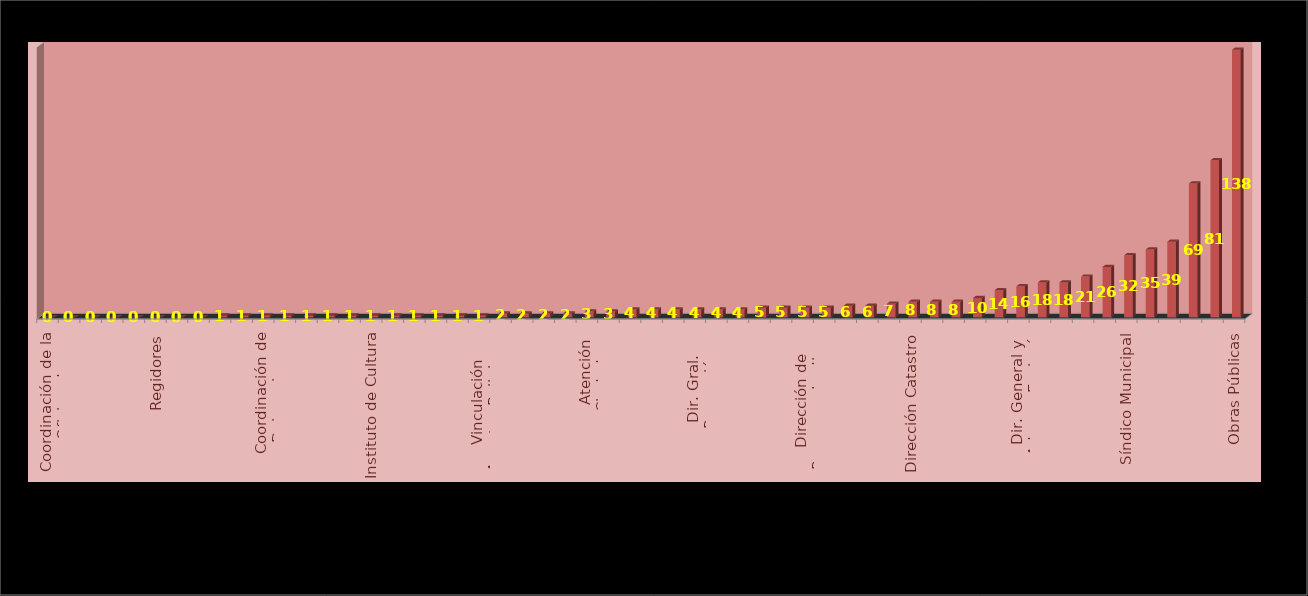
| Category | Series 0 | Series 1 |
|---|---|---|
| Coordinación de la Oficina de Presidencia  |  | 0 |
| Consejería Juridica |  | 0 |
| Dirección de Protección al Medio Ambiente |  | 0 |
| Instituto Municipal de la Juventud |  | 0 |
| Instituto Municipal de la Mujer |  | 0 |
| Regidores |  | 0 |
| Relaciones Exteriores |  | 0 |
| Sanidad Animal |  | 0 |
| Asuntos Internos |  | 1 |
| Comunidad Digna |  | 1 |
| Coordinación de Delegaciones |  | 1 |
| Coordinación de Gabinete |  | 1 |
| Dirección de Aseo Público |  | 1 |
| Dirección de Cementerios |  | 1 |
| Dirección de Transparencia y Acceso a la Información |  | 1 |
| Instituto de Cultura |  | 1 |
| Junta Municipal de Reclutamiento |  | 1 |
| Mantenimiento de Pavimentos |  | 1 |
| Rastros Municipales |  | 1 |
| Secretaria del Ayuntamiento |  | 1 |
| Vinculación Asuntos Religiosos |  | 1 |
| Coordinación General  Oficina Central de Gobierno, Estrategía y opinión Pública |  | 2 |
| Integración y Dictaminación |  | 2 |
| Mantenimiento Urbano |  | 2 |
| Registro Civil |  | 2 |
| Atención Ciudadana |  | 3 |
| Instituto de Capacitación y Oferta Educativa |  | 3 |
| Agua y Alcantarillado |  | 4 |
| Comunicación Social |  | 4 |
| Coplademun |  | 4 |
| Dir. Gral. Promoción Económica y T. |  | 4 |
| Proyectos Estratégicos |  | 4 |
| Relaciones Públicas |  | 4 |
| Alumbrado Público |  | 5 |
| Contraloría |  | 5 |
| Dirección de Parques y Jardines |  | 5 |
| Secretaría Particular |  | 5 |
| Dir. Gral. Innovación y Tecnología |  | 6 |
| Estacionómetros y Estacionamientos |  | 6 |
| Educación Municipal |  | 7 |
| Dirección Catastro |  | 8 |
| Participación Ciudadana |  | 8 |
| Protección Civil y Bomberos |  | 8 |
| Archivo Municipal |  | 10 |
| Actas y Acuerdos |  | 14 |
| Dir. General y Admva. Ecología |  | 16 |
| Dir. Gral. de Servicios Públicos |  | 18 |
| Patrimonio Municipal |  | 18 |
| Desarrollo Social Humano |  | 21 |
| Seguridad Pública |  | 26 |
| Síndico Municipal |  | 32 |
| Padrón y Licencias |  | 35 |
| Inspección de Reglamentos |  | 39 |
| Tesorero Municipal |  | 69 |
| Oficialía Mayor Administrativa |  | 81 |
| Obras Públicas |  | 138 |